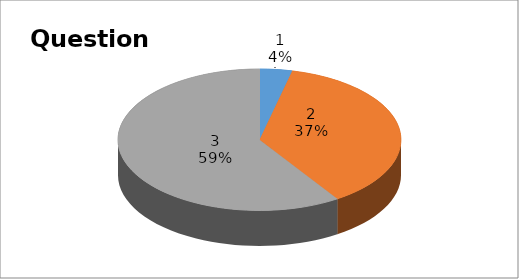
| Category | Series 0 |
|---|---|
| 0 | 2 |
| 1 | 20 |
| 2 | 32 |